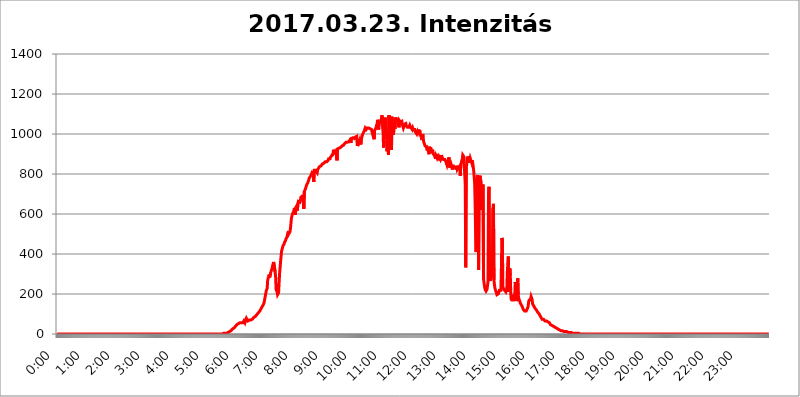
| Category | 2017.03.23. Intenzitás [W/m^2] |
|---|---|
| 0.0 | 0 |
| 0.0006944444444444445 | 0 |
| 0.001388888888888889 | 0 |
| 0.0020833333333333333 | 0 |
| 0.002777777777777778 | 0 |
| 0.003472222222222222 | 0 |
| 0.004166666666666667 | 0 |
| 0.004861111111111111 | 0 |
| 0.005555555555555556 | 0 |
| 0.0062499999999999995 | 0 |
| 0.006944444444444444 | 0 |
| 0.007638888888888889 | 0 |
| 0.008333333333333333 | 0 |
| 0.009027777777777779 | 0 |
| 0.009722222222222222 | 0 |
| 0.010416666666666666 | 0 |
| 0.011111111111111112 | 0 |
| 0.011805555555555555 | 0 |
| 0.012499999999999999 | 0 |
| 0.013194444444444444 | 0 |
| 0.013888888888888888 | 0 |
| 0.014583333333333332 | 0 |
| 0.015277777777777777 | 0 |
| 0.015972222222222224 | 0 |
| 0.016666666666666666 | 0 |
| 0.017361111111111112 | 0 |
| 0.018055555555555557 | 0 |
| 0.01875 | 0 |
| 0.019444444444444445 | 0 |
| 0.02013888888888889 | 0 |
| 0.020833333333333332 | 0 |
| 0.02152777777777778 | 0 |
| 0.022222222222222223 | 0 |
| 0.02291666666666667 | 0 |
| 0.02361111111111111 | 0 |
| 0.024305555555555556 | 0 |
| 0.024999999999999998 | 0 |
| 0.025694444444444447 | 0 |
| 0.02638888888888889 | 0 |
| 0.027083333333333334 | 0 |
| 0.027777777777777776 | 0 |
| 0.02847222222222222 | 0 |
| 0.029166666666666664 | 0 |
| 0.029861111111111113 | 0 |
| 0.030555555555555555 | 0 |
| 0.03125 | 0 |
| 0.03194444444444445 | 0 |
| 0.03263888888888889 | 0 |
| 0.03333333333333333 | 0 |
| 0.034027777777777775 | 0 |
| 0.034722222222222224 | 0 |
| 0.035416666666666666 | 0 |
| 0.036111111111111115 | 0 |
| 0.03680555555555556 | 0 |
| 0.0375 | 0 |
| 0.03819444444444444 | 0 |
| 0.03888888888888889 | 0 |
| 0.03958333333333333 | 0 |
| 0.04027777777777778 | 0 |
| 0.04097222222222222 | 0 |
| 0.041666666666666664 | 0 |
| 0.042361111111111106 | 0 |
| 0.04305555555555556 | 0 |
| 0.043750000000000004 | 0 |
| 0.044444444444444446 | 0 |
| 0.04513888888888889 | 0 |
| 0.04583333333333334 | 0 |
| 0.04652777777777778 | 0 |
| 0.04722222222222222 | 0 |
| 0.04791666666666666 | 0 |
| 0.04861111111111111 | 0 |
| 0.049305555555555554 | 0 |
| 0.049999999999999996 | 0 |
| 0.05069444444444445 | 0 |
| 0.051388888888888894 | 0 |
| 0.052083333333333336 | 0 |
| 0.05277777777777778 | 0 |
| 0.05347222222222222 | 0 |
| 0.05416666666666667 | 0 |
| 0.05486111111111111 | 0 |
| 0.05555555555555555 | 0 |
| 0.05625 | 0 |
| 0.05694444444444444 | 0 |
| 0.057638888888888885 | 0 |
| 0.05833333333333333 | 0 |
| 0.05902777777777778 | 0 |
| 0.059722222222222225 | 0 |
| 0.06041666666666667 | 0 |
| 0.061111111111111116 | 0 |
| 0.06180555555555556 | 0 |
| 0.0625 | 0 |
| 0.06319444444444444 | 0 |
| 0.06388888888888888 | 0 |
| 0.06458333333333334 | 0 |
| 0.06527777777777778 | 0 |
| 0.06597222222222222 | 0 |
| 0.06666666666666667 | 0 |
| 0.06736111111111111 | 0 |
| 0.06805555555555555 | 0 |
| 0.06874999999999999 | 0 |
| 0.06944444444444443 | 0 |
| 0.07013888888888889 | 0 |
| 0.07083333333333333 | 0 |
| 0.07152777777777779 | 0 |
| 0.07222222222222223 | 0 |
| 0.07291666666666667 | 0 |
| 0.07361111111111111 | 0 |
| 0.07430555555555556 | 0 |
| 0.075 | 0 |
| 0.07569444444444444 | 0 |
| 0.0763888888888889 | 0 |
| 0.07708333333333334 | 0 |
| 0.07777777777777778 | 0 |
| 0.07847222222222222 | 0 |
| 0.07916666666666666 | 0 |
| 0.0798611111111111 | 0 |
| 0.08055555555555556 | 0 |
| 0.08125 | 0 |
| 0.08194444444444444 | 0 |
| 0.08263888888888889 | 0 |
| 0.08333333333333333 | 0 |
| 0.08402777777777777 | 0 |
| 0.08472222222222221 | 0 |
| 0.08541666666666665 | 0 |
| 0.08611111111111112 | 0 |
| 0.08680555555555557 | 0 |
| 0.08750000000000001 | 0 |
| 0.08819444444444445 | 0 |
| 0.08888888888888889 | 0 |
| 0.08958333333333333 | 0 |
| 0.09027777777777778 | 0 |
| 0.09097222222222222 | 0 |
| 0.09166666666666667 | 0 |
| 0.09236111111111112 | 0 |
| 0.09305555555555556 | 0 |
| 0.09375 | 0 |
| 0.09444444444444444 | 0 |
| 0.09513888888888888 | 0 |
| 0.09583333333333333 | 0 |
| 0.09652777777777777 | 0 |
| 0.09722222222222222 | 0 |
| 0.09791666666666667 | 0 |
| 0.09861111111111111 | 0 |
| 0.09930555555555555 | 0 |
| 0.09999999999999999 | 0 |
| 0.10069444444444443 | 0 |
| 0.1013888888888889 | 0 |
| 0.10208333333333335 | 0 |
| 0.10277777777777779 | 0 |
| 0.10347222222222223 | 0 |
| 0.10416666666666667 | 0 |
| 0.10486111111111111 | 0 |
| 0.10555555555555556 | 0 |
| 0.10625 | 0 |
| 0.10694444444444444 | 0 |
| 0.1076388888888889 | 0 |
| 0.10833333333333334 | 0 |
| 0.10902777777777778 | 0 |
| 0.10972222222222222 | 0 |
| 0.1111111111111111 | 0 |
| 0.11180555555555556 | 0 |
| 0.11180555555555556 | 0 |
| 0.1125 | 0 |
| 0.11319444444444444 | 0 |
| 0.11388888888888889 | 0 |
| 0.11458333333333333 | 0 |
| 0.11527777777777777 | 0 |
| 0.11597222222222221 | 0 |
| 0.11666666666666665 | 0 |
| 0.1173611111111111 | 0 |
| 0.11805555555555557 | 0 |
| 0.11944444444444445 | 0 |
| 0.12013888888888889 | 0 |
| 0.12083333333333333 | 0 |
| 0.12152777777777778 | 0 |
| 0.12222222222222223 | 0 |
| 0.12291666666666667 | 0 |
| 0.12291666666666667 | 0 |
| 0.12361111111111112 | 0 |
| 0.12430555555555556 | 0 |
| 0.125 | 0 |
| 0.12569444444444444 | 0 |
| 0.12638888888888888 | 0 |
| 0.12708333333333333 | 0 |
| 0.16875 | 0 |
| 0.12847222222222224 | 0 |
| 0.12916666666666668 | 0 |
| 0.12986111111111112 | 0 |
| 0.13055555555555556 | 0 |
| 0.13125 | 0 |
| 0.13194444444444445 | 0 |
| 0.1326388888888889 | 0 |
| 0.13333333333333333 | 0 |
| 0.13402777777777777 | 0 |
| 0.13402777777777777 | 0 |
| 0.13472222222222222 | 0 |
| 0.13541666666666666 | 0 |
| 0.1361111111111111 | 0 |
| 0.13749999999999998 | 0 |
| 0.13819444444444443 | 0 |
| 0.1388888888888889 | 0 |
| 0.13958333333333334 | 0 |
| 0.14027777777777778 | 0 |
| 0.14097222222222222 | 0 |
| 0.14166666666666666 | 0 |
| 0.1423611111111111 | 0 |
| 0.14305555555555557 | 0 |
| 0.14375000000000002 | 0 |
| 0.14444444444444446 | 0 |
| 0.1451388888888889 | 0 |
| 0.1451388888888889 | 0 |
| 0.14652777777777778 | 0 |
| 0.14722222222222223 | 0 |
| 0.14791666666666667 | 0 |
| 0.1486111111111111 | 0 |
| 0.14930555555555555 | 0 |
| 0.15 | 0 |
| 0.15069444444444444 | 0 |
| 0.15138888888888888 | 0 |
| 0.15208333333333332 | 0 |
| 0.15277777777777776 | 0 |
| 0.15347222222222223 | 0 |
| 0.15416666666666667 | 0 |
| 0.15486111111111112 | 0 |
| 0.15555555555555556 | 0 |
| 0.15625 | 0 |
| 0.15694444444444444 | 0 |
| 0.15763888888888888 | 0 |
| 0.15833333333333333 | 0 |
| 0.15902777777777777 | 0 |
| 0.15972222222222224 | 0 |
| 0.16041666666666668 | 0 |
| 0.16111111111111112 | 0 |
| 0.16180555555555556 | 0 |
| 0.1625 | 0 |
| 0.16319444444444445 | 0 |
| 0.1638888888888889 | 0 |
| 0.16458333333333333 | 0 |
| 0.16527777777777777 | 0 |
| 0.16597222222222222 | 0 |
| 0.16666666666666666 | 0 |
| 0.1673611111111111 | 0 |
| 0.16805555555555554 | 0 |
| 0.16874999999999998 | 0 |
| 0.16944444444444443 | 0 |
| 0.17013888888888887 | 0 |
| 0.1708333333333333 | 0 |
| 0.17152777777777775 | 0 |
| 0.17222222222222225 | 0 |
| 0.1729166666666667 | 0 |
| 0.17361111111111113 | 0 |
| 0.17430555555555557 | 0 |
| 0.17500000000000002 | 0 |
| 0.17569444444444446 | 0 |
| 0.1763888888888889 | 0 |
| 0.17708333333333334 | 0 |
| 0.17777777777777778 | 0 |
| 0.17847222222222223 | 0 |
| 0.17916666666666667 | 0 |
| 0.1798611111111111 | 0 |
| 0.18055555555555555 | 0 |
| 0.18125 | 0 |
| 0.18194444444444444 | 0 |
| 0.1826388888888889 | 0 |
| 0.18333333333333335 | 0 |
| 0.1840277777777778 | 0 |
| 0.18472222222222223 | 0 |
| 0.18541666666666667 | 0 |
| 0.18611111111111112 | 0 |
| 0.18680555555555556 | 0 |
| 0.1875 | 0 |
| 0.18819444444444444 | 0 |
| 0.18888888888888888 | 0 |
| 0.18958333333333333 | 0 |
| 0.19027777777777777 | 0 |
| 0.1909722222222222 | 0 |
| 0.19166666666666665 | 0 |
| 0.19236111111111112 | 0 |
| 0.19305555555555554 | 0 |
| 0.19375 | 0 |
| 0.19444444444444445 | 0 |
| 0.1951388888888889 | 0 |
| 0.19583333333333333 | 0 |
| 0.19652777777777777 | 0 |
| 0.19722222222222222 | 0 |
| 0.19791666666666666 | 0 |
| 0.1986111111111111 | 0 |
| 0.19930555555555554 | 0 |
| 0.19999999999999998 | 0 |
| 0.20069444444444443 | 0 |
| 0.20138888888888887 | 0 |
| 0.2020833333333333 | 0 |
| 0.2027777777777778 | 0 |
| 0.2034722222222222 | 0 |
| 0.2041666666666667 | 0 |
| 0.20486111111111113 | 0 |
| 0.20555555555555557 | 0 |
| 0.20625000000000002 | 0 |
| 0.20694444444444446 | 0 |
| 0.2076388888888889 | 0 |
| 0.20833333333333334 | 0 |
| 0.20902777777777778 | 0 |
| 0.20972222222222223 | 0 |
| 0.21041666666666667 | 0 |
| 0.2111111111111111 | 0 |
| 0.21180555555555555 | 0 |
| 0.2125 | 0 |
| 0.21319444444444444 | 0 |
| 0.2138888888888889 | 0 |
| 0.21458333333333335 | 0 |
| 0.2152777777777778 | 0 |
| 0.21597222222222223 | 0 |
| 0.21666666666666667 | 0 |
| 0.21736111111111112 | 0 |
| 0.21805555555555556 | 0 |
| 0.21875 | 0 |
| 0.21944444444444444 | 0 |
| 0.22013888888888888 | 0 |
| 0.22083333333333333 | 0 |
| 0.22152777777777777 | 0 |
| 0.2222222222222222 | 0 |
| 0.22291666666666665 | 0 |
| 0.2236111111111111 | 0 |
| 0.22430555555555556 | 0 |
| 0.225 | 0 |
| 0.22569444444444445 | 0 |
| 0.2263888888888889 | 0 |
| 0.22708333333333333 | 0 |
| 0.22777777777777777 | 0 |
| 0.22847222222222222 | 0 |
| 0.22916666666666666 | 0 |
| 0.2298611111111111 | 0 |
| 0.23055555555555554 | 0 |
| 0.23124999999999998 | 0 |
| 0.23194444444444443 | 0 |
| 0.23263888888888887 | 0 |
| 0.2333333333333333 | 3.525 |
| 0.2340277777777778 | 0 |
| 0.2347222222222222 | 3.525 |
| 0.2354166666666667 | 3.525 |
| 0.23611111111111113 | 3.525 |
| 0.23680555555555557 | 3.525 |
| 0.23750000000000002 | 3.525 |
| 0.23819444444444446 | 3.525 |
| 0.2388888888888889 | 7.887 |
| 0.23958333333333334 | 7.887 |
| 0.24027777777777778 | 7.887 |
| 0.24097222222222223 | 12.257 |
| 0.24166666666666667 | 12.257 |
| 0.2423611111111111 | 12.257 |
| 0.24305555555555555 | 16.636 |
| 0.24375 | 16.636 |
| 0.24444444444444446 | 21.024 |
| 0.24513888888888888 | 21.024 |
| 0.24583333333333335 | 25.419 |
| 0.2465277777777778 | 25.419 |
| 0.24722222222222223 | 29.823 |
| 0.24791666666666667 | 29.823 |
| 0.24861111111111112 | 34.234 |
| 0.24930555555555556 | 34.234 |
| 0.25 | 38.653 |
| 0.25069444444444444 | 38.653 |
| 0.2513888888888889 | 43.079 |
| 0.2520833333333333 | 47.511 |
| 0.25277777777777777 | 47.511 |
| 0.2534722222222222 | 47.511 |
| 0.25416666666666665 | 51.951 |
| 0.2548611111111111 | 51.951 |
| 0.2555555555555556 | 56.398 |
| 0.25625000000000003 | 56.398 |
| 0.2569444444444445 | 56.398 |
| 0.2576388888888889 | 51.951 |
| 0.25833333333333336 | 56.398 |
| 0.2590277777777778 | 56.398 |
| 0.25972222222222224 | 51.951 |
| 0.2604166666666667 | 56.398 |
| 0.2611111111111111 | 60.85 |
| 0.26180555555555557 | 65.31 |
| 0.2625 | 65.31 |
| 0.26319444444444445 | 56.398 |
| 0.2638888888888889 | 65.31 |
| 0.26458333333333334 | 69.775 |
| 0.2652777777777778 | 78.722 |
| 0.2659722222222222 | 78.722 |
| 0.26666666666666666 | 74.246 |
| 0.2673611111111111 | 65.31 |
| 0.26805555555555555 | 65.31 |
| 0.26875 | 65.31 |
| 0.26944444444444443 | 69.775 |
| 0.2701388888888889 | 69.775 |
| 0.2708333333333333 | 69.775 |
| 0.27152777777777776 | 69.775 |
| 0.2722222222222222 | 74.246 |
| 0.27291666666666664 | 74.246 |
| 0.2736111111111111 | 74.246 |
| 0.2743055555555555 | 78.722 |
| 0.27499999999999997 | 78.722 |
| 0.27569444444444446 | 83.205 |
| 0.27638888888888885 | 83.205 |
| 0.27708333333333335 | 87.692 |
| 0.2777777777777778 | 87.692 |
| 0.27847222222222223 | 92.184 |
| 0.2791666666666667 | 92.184 |
| 0.2798611111111111 | 96.682 |
| 0.28055555555555556 | 96.682 |
| 0.28125 | 101.184 |
| 0.28194444444444444 | 105.69 |
| 0.2826388888888889 | 110.201 |
| 0.2833333333333333 | 110.201 |
| 0.28402777777777777 | 114.716 |
| 0.2847222222222222 | 119.235 |
| 0.28541666666666665 | 123.758 |
| 0.28611111111111115 | 128.284 |
| 0.28680555555555554 | 132.814 |
| 0.28750000000000003 | 137.347 |
| 0.2881944444444445 | 141.884 |
| 0.2888888888888889 | 146.423 |
| 0.28958333333333336 | 150.964 |
| 0.2902777777777778 | 160.056 |
| 0.29097222222222224 | 164.605 |
| 0.2916666666666667 | 187.378 |
| 0.2923611111111111 | 191.937 |
| 0.29305555555555557 | 214.746 |
| 0.29375 | 210.182 |
| 0.29444444444444445 | 228.436 |
| 0.2951388888888889 | 269.49 |
| 0.29583333333333334 | 278.603 |
| 0.2965277777777778 | 287.709 |
| 0.2972222222222222 | 296.808 |
| 0.29791666666666666 | 283.156 |
| 0.2986111111111111 | 287.709 |
| 0.29930555555555555 | 305.898 |
| 0.3 | 310.44 |
| 0.30069444444444443 | 310.44 |
| 0.3013888888888889 | 328.584 |
| 0.3020833333333333 | 342.162 |
| 0.30277777777777776 | 346.682 |
| 0.3034722222222222 | 360.221 |
| 0.30416666666666664 | 355.712 |
| 0.3048611111111111 | 355.712 |
| 0.3055555555555555 | 310.44 |
| 0.30624999999999997 | 287.709 |
| 0.3069444444444444 | 223.873 |
| 0.3076388888888889 | 223.873 |
| 0.30833333333333335 | 210.182 |
| 0.3090277777777778 | 196.497 |
| 0.30972222222222223 | 201.058 |
| 0.3104166666666667 | 205.62 |
| 0.3111111111111111 | 210.182 |
| 0.31180555555555556 | 301.354 |
| 0.3125 | 328.584 |
| 0.31319444444444444 | 360.221 |
| 0.3138888888888889 | 387.202 |
| 0.3145833333333333 | 414.035 |
| 0.31527777777777777 | 418.492 |
| 0.3159722222222222 | 431.833 |
| 0.31666666666666665 | 440.702 |
| 0.31736111111111115 | 440.702 |
| 0.31805555555555554 | 449.551 |
| 0.31875000000000003 | 458.38 |
| 0.3194444444444445 | 462.786 |
| 0.3201388888888889 | 467.187 |
| 0.32083333333333336 | 475.972 |
| 0.3215277777777778 | 480.356 |
| 0.32222222222222224 | 484.735 |
| 0.3229166666666667 | 497.836 |
| 0.3236111111111111 | 497.836 |
| 0.32430555555555557 | 515.223 |
| 0.325 | 502.192 |
| 0.32569444444444445 | 506.542 |
| 0.3263888888888889 | 510.885 |
| 0.32708333333333334 | 528.2 |
| 0.3277777777777778 | 553.986 |
| 0.3284722222222222 | 579.542 |
| 0.32916666666666666 | 583.779 |
| 0.3298611111111111 | 600.661 |
| 0.33055555555555555 | 604.864 |
| 0.33125 | 609.062 |
| 0.33194444444444443 | 617.436 |
| 0.3326388888888889 | 629.948 |
| 0.3333333333333333 | 621.613 |
| 0.3340277777777778 | 596.45 |
| 0.3347222222222222 | 634.105 |
| 0.3354166666666667 | 638.256 |
| 0.3361111111111111 | 642.4 |
| 0.3368055555555556 | 617.436 |
| 0.33749999999999997 | 650.667 |
| 0.33819444444444446 | 663.019 |
| 0.33888888888888885 | 658.909 |
| 0.33958333333333335 | 663.019 |
| 0.34027777777777773 | 658.909 |
| 0.34097222222222223 | 667.123 |
| 0.3416666666666666 | 683.473 |
| 0.3423611111111111 | 683.473 |
| 0.3430555555555555 | 683.473 |
| 0.34375 | 687.544 |
| 0.3444444444444445 | 695.666 |
| 0.3451388888888889 | 699.717 |
| 0.3458333333333334 | 625.784 |
| 0.34652777777777777 | 711.832 |
| 0.34722222222222227 | 715.858 |
| 0.34791666666666665 | 723.889 |
| 0.34861111111111115 | 731.896 |
| 0.34930555555555554 | 735.89 |
| 0.35000000000000003 | 747.834 |
| 0.3506944444444444 | 751.803 |
| 0.3513888888888889 | 755.766 |
| 0.3520833333333333 | 763.674 |
| 0.3527777777777778 | 771.559 |
| 0.3534722222222222 | 779.42 |
| 0.3541666666666667 | 779.42 |
| 0.3548611111111111 | 783.342 |
| 0.35555555555555557 | 791.169 |
| 0.35625 | 795.074 |
| 0.35694444444444445 | 802.868 |
| 0.3576388888888889 | 806.757 |
| 0.35833333333333334 | 791.169 |
| 0.3590277777777778 | 814.519 |
| 0.3597222222222222 | 759.723 |
| 0.36041666666666666 | 818.392 |
| 0.3611111111111111 | 814.519 |
| 0.36180555555555555 | 818.392 |
| 0.3625 | 818.392 |
| 0.36319444444444443 | 818.392 |
| 0.3638888888888889 | 818.392 |
| 0.3645833333333333 | 806.757 |
| 0.3652777777777778 | 822.26 |
| 0.3659722222222222 | 826.123 |
| 0.3666666666666667 | 829.981 |
| 0.3673611111111111 | 829.981 |
| 0.3680555555555556 | 837.682 |
| 0.36874999999999997 | 837.682 |
| 0.36944444444444446 | 837.682 |
| 0.37013888888888885 | 841.526 |
| 0.37083333333333335 | 845.365 |
| 0.37152777777777773 | 849.199 |
| 0.37222222222222223 | 849.199 |
| 0.3729166666666666 | 853.029 |
| 0.3736111111111111 | 853.029 |
| 0.3743055555555555 | 856.855 |
| 0.375 | 856.855 |
| 0.3756944444444445 | 860.676 |
| 0.3763888888888889 | 860.676 |
| 0.3770833333333334 | 860.676 |
| 0.37777777777777777 | 860.676 |
| 0.37847222222222227 | 864.493 |
| 0.37916666666666665 | 864.493 |
| 0.37986111111111115 | 868.305 |
| 0.38055555555555554 | 875.918 |
| 0.38125000000000003 | 879.719 |
| 0.3819444444444444 | 875.918 |
| 0.3826388888888889 | 875.918 |
| 0.3833333333333333 | 883.516 |
| 0.3840277777777778 | 887.309 |
| 0.3847222222222222 | 891.099 |
| 0.3854166666666667 | 894.885 |
| 0.3861111111111111 | 894.885 |
| 0.38680555555555557 | 902.447 |
| 0.3875 | 921.298 |
| 0.38819444444444445 | 906.223 |
| 0.3888888888888889 | 906.223 |
| 0.38958333333333334 | 913.766 |
| 0.3902777777777778 | 917.534 |
| 0.3909722222222222 | 902.447 |
| 0.39166666666666666 | 917.534 |
| 0.3923611111111111 | 868.305 |
| 0.39305555555555555 | 925.06 |
| 0.39375 | 925.06 |
| 0.39444444444444443 | 925.06 |
| 0.3951388888888889 | 928.819 |
| 0.3958333333333333 | 928.819 |
| 0.3965277777777778 | 932.576 |
| 0.3972222222222222 | 932.576 |
| 0.3979166666666667 | 932.576 |
| 0.3986111111111111 | 936.33 |
| 0.3993055555555556 | 940.082 |
| 0.39999999999999997 | 940.082 |
| 0.40069444444444446 | 943.832 |
| 0.40138888888888885 | 943.832 |
| 0.40208333333333335 | 947.58 |
| 0.40277777777777773 | 951.327 |
| 0.40347222222222223 | 951.327 |
| 0.4041666666666666 | 955.071 |
| 0.4048611111111111 | 958.814 |
| 0.4055555555555555 | 958.814 |
| 0.40625 | 955.071 |
| 0.4069444444444445 | 958.814 |
| 0.4076388888888889 | 958.814 |
| 0.4083333333333334 | 962.555 |
| 0.40902777777777777 | 962.555 |
| 0.40972222222222227 | 966.295 |
| 0.41041666666666665 | 970.034 |
| 0.41111111111111115 | 970.034 |
| 0.41180555555555554 | 955.071 |
| 0.41250000000000003 | 977.508 |
| 0.4131944444444444 | 977.508 |
| 0.4138888888888889 | 977.508 |
| 0.4145833333333333 | 981.244 |
| 0.4152777777777778 | 977.508 |
| 0.4159722222222222 | 977.508 |
| 0.4166666666666667 | 977.508 |
| 0.4173611111111111 | 981.244 |
| 0.41805555555555557 | 984.98 |
| 0.41875 | 984.98 |
| 0.41944444444444445 | 984.98 |
| 0.4201388888888889 | 988.714 |
| 0.42083333333333334 | 940.082 |
| 0.4215277777777778 | 947.58 |
| 0.4222222222222222 | 958.814 |
| 0.42291666666666666 | 973.772 |
| 0.4236111111111111 | 962.555 |
| 0.42430555555555555 | 970.034 |
| 0.425 | 970.034 |
| 0.42569444444444443 | 947.58 |
| 0.4263888888888889 | 966.295 |
| 0.4270833333333333 | 984.98 |
| 0.4277777777777778 | 984.98 |
| 0.4284722222222222 | 999.916 |
| 0.4291666666666667 | 999.916 |
| 0.4298611111111111 | 999.916 |
| 0.4305555555555556 | 1014.852 |
| 0.43124999999999997 | 1018.587 |
| 0.43194444444444446 | 1029.798 |
| 0.43263888888888885 | 1029.798 |
| 0.43333333333333335 | 1022.323 |
| 0.43402777777777773 | 1026.06 |
| 0.43472222222222223 | 1029.798 |
| 0.4354166666666666 | 1029.798 |
| 0.4361111111111111 | 1033.537 |
| 0.4368055555555555 | 1029.798 |
| 0.4375 | 1029.798 |
| 0.4381944444444445 | 1029.798 |
| 0.4388888888888889 | 1026.06 |
| 0.4395833333333334 | 1029.798 |
| 0.44027777777777777 | 1022.323 |
| 0.44097222222222227 | 1022.323 |
| 0.44166666666666665 | 1007.383 |
| 0.44236111111111115 | 1011.118 |
| 0.44305555555555554 | 1007.383 |
| 0.44375000000000003 | 981.244 |
| 0.4444444444444444 | 973.772 |
| 0.4451388888888889 | 1018.587 |
| 0.4458333333333333 | 1014.852 |
| 0.4465277777777778 | 1026.06 |
| 0.4472222222222222 | 1033.537 |
| 0.4479166666666667 | 1044.762 |
| 0.4486111111111111 | 1052.255 |
| 0.44930555555555557 | 1071.027 |
| 0.45 | 1059.756 |
| 0.45069444444444445 | 1022.323 |
| 0.4513888888888889 | 1052.255 |
| 0.45208333333333334 | 1063.51 |
| 0.4527777777777778 | 1052.255 |
| 0.4534722222222222 | 1052.255 |
| 0.45416666666666666 | 1071.027 |
| 0.4548611111111111 | 1078.555 |
| 0.45555555555555555 | 1093.653 |
| 0.45625 | 1089.873 |
| 0.45694444444444443 | 1018.587 |
| 0.4576388888888889 | 932.576 |
| 0.4583333333333333 | 966.295 |
| 0.4590277777777778 | 1052.255 |
| 0.4597222222222222 | 1082.324 |
| 0.4604166666666667 | 1067.267 |
| 0.4611111111111111 | 1071.027 |
| 0.4618055555555556 | 992.448 |
| 0.46249999999999997 | 913.766 |
| 0.46319444444444446 | 970.034 |
| 0.46388888888888885 | 921.298 |
| 0.46458333333333335 | 894.885 |
| 0.46527777777777773 | 1093.653 |
| 0.46597222222222223 | 1037.277 |
| 0.4666666666666666 | 943.832 |
| 0.4673611111111111 | 943.832 |
| 0.4680555555555555 | 992.448 |
| 0.46875 | 921.298 |
| 0.4694444444444445 | 1086.097 |
| 0.4701388888888889 | 1037.277 |
| 0.4708333333333334 | 1029.798 |
| 0.47152777777777777 | 996.182 |
| 0.47222222222222227 | 999.916 |
| 0.47291666666666665 | 1063.51 |
| 0.47361111111111115 | 1026.06 |
| 0.47430555555555554 | 1082.324 |
| 0.47500000000000003 | 1074.789 |
| 0.4756944444444444 | 1071.027 |
| 0.4763888888888889 | 1078.555 |
| 0.4770833333333333 | 1074.789 |
| 0.4777777777777778 | 1067.267 |
| 0.4784722222222222 | 1074.789 |
| 0.4791666666666667 | 1033.537 |
| 0.4798611111111111 | 1067.267 |
| 0.48055555555555557 | 1067.267 |
| 0.48125 | 1059.756 |
| 0.48194444444444445 | 1059.756 |
| 0.4826388888888889 | 1063.51 |
| 0.48333333333333334 | 1063.51 |
| 0.4840277777777778 | 1044.762 |
| 0.4847222222222222 | 1044.762 |
| 0.48541666666666666 | 1029.798 |
| 0.4861111111111111 | 1037.277 |
| 0.48680555555555555 | 1048.508 |
| 0.4875 | 1044.762 |
| 0.48819444444444443 | 1044.762 |
| 0.4888888888888889 | 1052.255 |
| 0.4895833333333333 | 1041.019 |
| 0.4902777777777778 | 1037.277 |
| 0.4909722222222222 | 1033.537 |
| 0.4916666666666667 | 1033.537 |
| 0.4923611111111111 | 1033.537 |
| 0.4930555555555556 | 1033.537 |
| 0.49374999999999997 | 1037.277 |
| 0.49444444444444446 | 1044.762 |
| 0.49513888888888885 | 1041.019 |
| 0.49583333333333335 | 1033.537 |
| 0.49652777777777773 | 1029.798 |
| 0.49722222222222223 | 1033.537 |
| 0.4979166666666666 | 1022.323 |
| 0.4986111111111111 | 1029.798 |
| 0.4993055555555555 | 1022.323 |
| 0.5 | 1018.587 |
| 0.5006944444444444 | 1026.06 |
| 0.5013888888888889 | 1022.323 |
| 0.5020833333333333 | 1011.118 |
| 0.5027777777777778 | 1007.383 |
| 0.5034722222222222 | 1007.383 |
| 0.5041666666666667 | 999.916 |
| 0.5048611111111111 | 1007.383 |
| 0.5055555555555555 | 996.182 |
| 0.50625 | 1007.383 |
| 0.5069444444444444 | 1022.323 |
| 0.5076388888888889 | 1011.118 |
| 0.5083333333333333 | 1018.587 |
| 0.5090277777777777 | 999.916 |
| 0.5097222222222222 | 992.448 |
| 0.5104166666666666 | 999.916 |
| 0.5111111111111112 | 977.508 |
| 0.5118055555555555 | 970.034 |
| 0.5125000000000001 | 999.916 |
| 0.5131944444444444 | 984.98 |
| 0.513888888888889 | 962.555 |
| 0.5145833333333333 | 958.814 |
| 0.5152777777777778 | 947.58 |
| 0.5159722222222222 | 940.082 |
| 0.5166666666666667 | 936.33 |
| 0.517361111111111 | 943.832 |
| 0.5180555555555556 | 932.576 |
| 0.5187499999999999 | 917.534 |
| 0.5194444444444445 | 925.06 |
| 0.5201388888888888 | 925.06 |
| 0.5208333333333334 | 909.996 |
| 0.5215277777777778 | 898.668 |
| 0.5222222222222223 | 936.33 |
| 0.5229166666666667 | 917.534 |
| 0.5236111111111111 | 932.576 |
| 0.5243055555555556 | 925.06 |
| 0.525 | 913.766 |
| 0.5256944444444445 | 906.223 |
| 0.5263888888888889 | 921.298 |
| 0.5270833333333333 | 902.447 |
| 0.5277777777777778 | 902.447 |
| 0.5284722222222222 | 898.668 |
| 0.5291666666666667 | 891.099 |
| 0.5298611111111111 | 891.099 |
| 0.5305555555555556 | 875.918 |
| 0.53125 | 891.099 |
| 0.5319444444444444 | 894.885 |
| 0.5326388888888889 | 879.719 |
| 0.5333333333333333 | 887.309 |
| 0.5340277777777778 | 887.309 |
| 0.5347222222222222 | 879.719 |
| 0.5354166666666667 | 887.309 |
| 0.5361111111111111 | 887.309 |
| 0.5368055555555555 | 887.309 |
| 0.5375 | 872.114 |
| 0.5381944444444444 | 879.719 |
| 0.5388888888888889 | 894.885 |
| 0.5395833333333333 | 883.516 |
| 0.5402777777777777 | 887.309 |
| 0.5409722222222222 | 883.516 |
| 0.5416666666666666 | 872.114 |
| 0.5423611111111112 | 872.114 |
| 0.5430555555555555 | 872.114 |
| 0.5437500000000001 | 872.114 |
| 0.5444444444444444 | 868.305 |
| 0.545138888888889 | 860.676 |
| 0.5458333333333333 | 853.029 |
| 0.5465277777777778 | 845.365 |
| 0.5472222222222222 | 856.855 |
| 0.5479166666666667 | 860.676 |
| 0.548611111111111 | 868.305 |
| 0.5493055555555556 | 883.516 |
| 0.5499999999999999 | 845.365 |
| 0.5506944444444445 | 829.981 |
| 0.5513888888888888 | 845.365 |
| 0.5520833333333334 | 853.029 |
| 0.5527777777777778 | 845.365 |
| 0.5534722222222223 | 833.834 |
| 0.5541666666666667 | 822.26 |
| 0.5548611111111111 | 845.365 |
| 0.5555555555555556 | 837.682 |
| 0.55625 | 837.682 |
| 0.5569444444444445 | 837.682 |
| 0.5576388888888889 | 829.981 |
| 0.5583333333333333 | 826.123 |
| 0.5590277777777778 | 826.123 |
| 0.5597222222222222 | 826.123 |
| 0.5604166666666667 | 841.526 |
| 0.5611111111111111 | 822.26 |
| 0.5618055555555556 | 826.123 |
| 0.5625 | 829.981 |
| 0.5631944444444444 | 822.26 |
| 0.5638888888888889 | 833.834 |
| 0.5645833333333333 | 826.123 |
| 0.5652777777777778 | 791.169 |
| 0.5659722222222222 | 849.199 |
| 0.5666666666666667 | 856.855 |
| 0.5673611111111111 | 860.676 |
| 0.5680555555555555 | 875.918 |
| 0.56875 | 894.885 |
| 0.5694444444444444 | 898.668 |
| 0.5701388888888889 | 887.309 |
| 0.5708333333333333 | 887.309 |
| 0.5715277777777777 | 883.516 |
| 0.5722222222222222 | 751.803 |
| 0.5729166666666666 | 333.113 |
| 0.5736111111111112 | 833.834 |
| 0.5743055555555555 | 845.365 |
| 0.5750000000000001 | 887.309 |
| 0.5756944444444444 | 887.309 |
| 0.576388888888889 | 875.918 |
| 0.5770833333333333 | 868.305 |
| 0.5777777777777778 | 856.855 |
| 0.5784722222222222 | 868.305 |
| 0.5791666666666667 | 879.719 |
| 0.579861111111111 | 872.114 |
| 0.5805555555555556 | 864.493 |
| 0.5812499999999999 | 856.855 |
| 0.5819444444444445 | 868.305 |
| 0.5826388888888888 | 856.855 |
| 0.5833333333333334 | 837.682 |
| 0.5840277777777778 | 818.392 |
| 0.5847222222222223 | 787.258 |
| 0.5854166666666667 | 755.766 |
| 0.5861111111111111 | 650.667 |
| 0.5868055555555556 | 497.836 |
| 0.5875 | 409.574 |
| 0.5881944444444445 | 775.492 |
| 0.5888888888888889 | 783.342 |
| 0.5895833333333333 | 795.074 |
| 0.5902777777777778 | 751.803 |
| 0.5909722222222222 | 319.517 |
| 0.5916666666666667 | 723.889 |
| 0.5923611111111111 | 683.473 |
| 0.5930555555555556 | 791.169 |
| 0.59375 | 795.074 |
| 0.5944444444444444 | 751.803 |
| 0.5951388888888889 | 621.613 |
| 0.5958333333333333 | 707.8 |
| 0.5965277777777778 | 739.877 |
| 0.5972222222222222 | 747.834 |
| 0.5979166666666667 | 274.047 |
| 0.5986111111111111 | 278.603 |
| 0.5993055555555555 | 237.564 |
| 0.6 | 223.873 |
| 0.6006944444444444 | 219.309 |
| 0.6013888888888889 | 214.746 |
| 0.6020833333333333 | 214.746 |
| 0.6027777777777777 | 223.873 |
| 0.6034722222222222 | 228.436 |
| 0.6041666666666666 | 260.373 |
| 0.6048611111111112 | 699.717 |
| 0.6055555555555555 | 735.89 |
| 0.6062500000000001 | 314.98 |
| 0.6069444444444444 | 292.259 |
| 0.607638888888889 | 264.932 |
| 0.6083333333333333 | 269.49 |
| 0.6090277777777778 | 364.728 |
| 0.6097222222222222 | 319.517 |
| 0.6104166666666667 | 283.156 |
| 0.611111111111111 | 629.948 |
| 0.6118055555555556 | 650.667 |
| 0.6124999999999999 | 269.49 |
| 0.6131944444444445 | 246.689 |
| 0.6138888888888888 | 228.436 |
| 0.6145833333333334 | 223.873 |
| 0.6152777777777778 | 223.873 |
| 0.6159722222222223 | 205.62 |
| 0.6166666666666667 | 196.497 |
| 0.6173611111111111 | 201.058 |
| 0.6180555555555556 | 196.497 |
| 0.61875 | 201.058 |
| 0.6194444444444445 | 210.182 |
| 0.6201388888888889 | 219.309 |
| 0.6208333333333333 | 219.309 |
| 0.6215277777777778 | 219.309 |
| 0.6222222222222222 | 219.309 |
| 0.6229166666666667 | 328.584 |
| 0.6236111111111111 | 480.356 |
| 0.6243055555555556 | 471.582 |
| 0.625 | 237.564 |
| 0.6256944444444444 | 228.436 |
| 0.6263888888888889 | 223.873 |
| 0.6270833333333333 | 219.309 |
| 0.6277777777777778 | 219.309 |
| 0.6284722222222222 | 219.309 |
| 0.6291666666666667 | 210.182 |
| 0.6298611111111111 | 205.62 |
| 0.6305555555555555 | 228.436 |
| 0.63125 | 310.44 |
| 0.6319444444444444 | 351.198 |
| 0.6326388888888889 | 387.202 |
| 0.6333333333333333 | 210.182 |
| 0.6340277777777777 | 255.813 |
| 0.6347222222222222 | 328.584 |
| 0.6354166666666666 | 292.259 |
| 0.6361111111111112 | 201.058 |
| 0.6368055555555555 | 169.156 |
| 0.6375000000000001 | 178.264 |
| 0.6381944444444444 | 164.605 |
| 0.638888888888889 | 160.056 |
| 0.6395833333333333 | 196.497 |
| 0.6402777777777778 | 164.605 |
| 0.6409722222222222 | 160.056 |
| 0.6416666666666667 | 191.937 |
| 0.642361111111111 | 260.373 |
| 0.6430555555555556 | 237.564 |
| 0.6437499999999999 | 164.605 |
| 0.6444444444444445 | 169.156 |
| 0.6451388888888888 | 182.82 |
| 0.6458333333333334 | 278.603 |
| 0.6465277777777778 | 196.497 |
| 0.6472222222222223 | 178.264 |
| 0.6479166666666667 | 173.709 |
| 0.6486111111111111 | 164.605 |
| 0.6493055555555556 | 155.509 |
| 0.65 | 150.964 |
| 0.6506944444444445 | 146.423 |
| 0.6513888888888889 | 141.884 |
| 0.6520833333333333 | 137.347 |
| 0.6527777777777778 | 132.814 |
| 0.6534722222222222 | 123.758 |
| 0.6541666666666667 | 119.235 |
| 0.6548611111111111 | 119.235 |
| 0.6555555555555556 | 114.716 |
| 0.65625 | 114.716 |
| 0.6569444444444444 | 114.716 |
| 0.6576388888888889 | 114.716 |
| 0.6583333333333333 | 119.235 |
| 0.6590277777777778 | 123.758 |
| 0.6597222222222222 | 128.284 |
| 0.6604166666666667 | 137.347 |
| 0.6611111111111111 | 160.056 |
| 0.6618055555555555 | 169.156 |
| 0.6625 | 164.605 |
| 0.6631944444444444 | 169.156 |
| 0.6638888888888889 | 173.709 |
| 0.6645833333333333 | 187.378 |
| 0.6652777777777777 | 187.378 |
| 0.6659722222222222 | 173.709 |
| 0.6666666666666666 | 150.964 |
| 0.6673611111111111 | 146.423 |
| 0.6680555555555556 | 150.964 |
| 0.6687500000000001 | 137.347 |
| 0.6694444444444444 | 137.347 |
| 0.6701388888888888 | 128.284 |
| 0.6708333333333334 | 123.758 |
| 0.6715277777777778 | 123.758 |
| 0.6722222222222222 | 119.235 |
| 0.6729166666666666 | 114.716 |
| 0.6736111111111112 | 110.201 |
| 0.6743055555555556 | 110.201 |
| 0.6749999999999999 | 105.69 |
| 0.6756944444444444 | 101.184 |
| 0.6763888888888889 | 96.682 |
| 0.6770833333333334 | 92.184 |
| 0.6777777777777777 | 87.692 |
| 0.6784722222222223 | 83.205 |
| 0.6791666666666667 | 78.722 |
| 0.6798611111111111 | 74.246 |
| 0.6805555555555555 | 74.246 |
| 0.68125 | 74.246 |
| 0.6819444444444445 | 74.246 |
| 0.6826388888888889 | 69.775 |
| 0.6833333333333332 | 69.775 |
| 0.6840277777777778 | 65.31 |
| 0.6847222222222222 | 65.31 |
| 0.6854166666666667 | 65.31 |
| 0.686111111111111 | 65.31 |
| 0.6868055555555556 | 65.31 |
| 0.6875 | 60.85 |
| 0.6881944444444444 | 60.85 |
| 0.688888888888889 | 56.398 |
| 0.6895833333333333 | 56.398 |
| 0.6902777777777778 | 56.398 |
| 0.6909722222222222 | 51.951 |
| 0.6916666666666668 | 47.511 |
| 0.6923611111111111 | 47.511 |
| 0.6930555555555555 | 43.079 |
| 0.69375 | 43.079 |
| 0.6944444444444445 | 43.079 |
| 0.6951388888888889 | 38.653 |
| 0.6958333333333333 | 38.653 |
| 0.6965277777777777 | 34.234 |
| 0.6972222222222223 | 34.234 |
| 0.6979166666666666 | 34.234 |
| 0.6986111111111111 | 29.823 |
| 0.6993055555555556 | 29.823 |
| 0.7000000000000001 | 29.823 |
| 0.7006944444444444 | 25.419 |
| 0.7013888888888888 | 25.419 |
| 0.7020833333333334 | 25.419 |
| 0.7027777777777778 | 25.419 |
| 0.7034722222222222 | 21.024 |
| 0.7041666666666666 | 21.024 |
| 0.7048611111111112 | 21.024 |
| 0.7055555555555556 | 21.024 |
| 0.7062499999999999 | 16.636 |
| 0.7069444444444444 | 16.636 |
| 0.7076388888888889 | 16.636 |
| 0.7083333333333334 | 16.636 |
| 0.7090277777777777 | 16.636 |
| 0.7097222222222223 | 12.257 |
| 0.7104166666666667 | 12.257 |
| 0.7111111111111111 | 12.257 |
| 0.7118055555555555 | 12.257 |
| 0.7125 | 12.257 |
| 0.7131944444444445 | 12.257 |
| 0.7138888888888889 | 12.257 |
| 0.7145833333333332 | 12.257 |
| 0.7152777777777778 | 7.887 |
| 0.7159722222222222 | 7.887 |
| 0.7166666666666667 | 7.887 |
| 0.717361111111111 | 7.887 |
| 0.7180555555555556 | 7.887 |
| 0.71875 | 7.887 |
| 0.7194444444444444 | 7.887 |
| 0.720138888888889 | 7.887 |
| 0.7208333333333333 | 7.887 |
| 0.7215277777777778 | 3.525 |
| 0.7222222222222222 | 3.525 |
| 0.7229166666666668 | 3.525 |
| 0.7236111111111111 | 3.525 |
| 0.7243055555555555 | 3.525 |
| 0.725 | 3.525 |
| 0.7256944444444445 | 3.525 |
| 0.7263888888888889 | 3.525 |
| 0.7270833333333333 | 3.525 |
| 0.7277777777777777 | 3.525 |
| 0.7284722222222223 | 3.525 |
| 0.7291666666666666 | 3.525 |
| 0.7298611111111111 | 3.525 |
| 0.7305555555555556 | 3.525 |
| 0.7312500000000001 | 3.525 |
| 0.7319444444444444 | 3.525 |
| 0.7326388888888888 | 3.525 |
| 0.7333333333333334 | 0 |
| 0.7340277777777778 | 0 |
| 0.7347222222222222 | 0 |
| 0.7354166666666666 | 0 |
| 0.7361111111111112 | 0 |
| 0.7368055555555556 | 0 |
| 0.7374999999999999 | 0 |
| 0.7381944444444444 | 0 |
| 0.7388888888888889 | 0 |
| 0.7395833333333334 | 0 |
| 0.7402777777777777 | 0 |
| 0.7409722222222223 | 0 |
| 0.7416666666666667 | 0 |
| 0.7423611111111111 | 0 |
| 0.7430555555555555 | 0 |
| 0.74375 | 0 |
| 0.7444444444444445 | 0 |
| 0.7451388888888889 | 0 |
| 0.7458333333333332 | 0 |
| 0.7465277777777778 | 0 |
| 0.7472222222222222 | 0 |
| 0.7479166666666667 | 0 |
| 0.748611111111111 | 0 |
| 0.7493055555555556 | 0 |
| 0.75 | 0 |
| 0.7506944444444444 | 0 |
| 0.751388888888889 | 0 |
| 0.7520833333333333 | 0 |
| 0.7527777777777778 | 0 |
| 0.7534722222222222 | 0 |
| 0.7541666666666668 | 0 |
| 0.7548611111111111 | 0 |
| 0.7555555555555555 | 0 |
| 0.75625 | 0 |
| 0.7569444444444445 | 0 |
| 0.7576388888888889 | 0 |
| 0.7583333333333333 | 0 |
| 0.7590277777777777 | 0 |
| 0.7597222222222223 | 0 |
| 0.7604166666666666 | 0 |
| 0.7611111111111111 | 0 |
| 0.7618055555555556 | 0 |
| 0.7625000000000001 | 0 |
| 0.7631944444444444 | 0 |
| 0.7638888888888888 | 0 |
| 0.7645833333333334 | 0 |
| 0.7652777777777778 | 0 |
| 0.7659722222222222 | 0 |
| 0.7666666666666666 | 0 |
| 0.7673611111111112 | 0 |
| 0.7680555555555556 | 0 |
| 0.7687499999999999 | 0 |
| 0.7694444444444444 | 0 |
| 0.7701388888888889 | 0 |
| 0.7708333333333334 | 0 |
| 0.7715277777777777 | 0 |
| 0.7722222222222223 | 0 |
| 0.7729166666666667 | 0 |
| 0.7736111111111111 | 0 |
| 0.7743055555555555 | 0 |
| 0.775 | 0 |
| 0.7756944444444445 | 0 |
| 0.7763888888888889 | 0 |
| 0.7770833333333332 | 0 |
| 0.7777777777777778 | 0 |
| 0.7784722222222222 | 0 |
| 0.7791666666666667 | 0 |
| 0.779861111111111 | 0 |
| 0.7805555555555556 | 0 |
| 0.78125 | 0 |
| 0.7819444444444444 | 0 |
| 0.782638888888889 | 0 |
| 0.7833333333333333 | 0 |
| 0.7840277777777778 | 0 |
| 0.7847222222222222 | 0 |
| 0.7854166666666668 | 0 |
| 0.7861111111111111 | 0 |
| 0.7868055555555555 | 0 |
| 0.7875 | 0 |
| 0.7881944444444445 | 0 |
| 0.7888888888888889 | 0 |
| 0.7895833333333333 | 0 |
| 0.7902777777777777 | 0 |
| 0.7909722222222223 | 0 |
| 0.7916666666666666 | 0 |
| 0.7923611111111111 | 0 |
| 0.7930555555555556 | 0 |
| 0.7937500000000001 | 0 |
| 0.7944444444444444 | 0 |
| 0.7951388888888888 | 0 |
| 0.7958333333333334 | 0 |
| 0.7965277777777778 | 0 |
| 0.7972222222222222 | 0 |
| 0.7979166666666666 | 0 |
| 0.7986111111111112 | 0 |
| 0.7993055555555556 | 0 |
| 0.7999999999999999 | 0 |
| 0.8006944444444444 | 0 |
| 0.8013888888888889 | 0 |
| 0.8020833333333334 | 0 |
| 0.8027777777777777 | 0 |
| 0.8034722222222223 | 0 |
| 0.8041666666666667 | 0 |
| 0.8048611111111111 | 0 |
| 0.8055555555555555 | 0 |
| 0.80625 | 0 |
| 0.8069444444444445 | 0 |
| 0.8076388888888889 | 0 |
| 0.8083333333333332 | 0 |
| 0.8090277777777778 | 0 |
| 0.8097222222222222 | 0 |
| 0.8104166666666667 | 0 |
| 0.811111111111111 | 0 |
| 0.8118055555555556 | 0 |
| 0.8125 | 0 |
| 0.8131944444444444 | 0 |
| 0.813888888888889 | 0 |
| 0.8145833333333333 | 0 |
| 0.8152777777777778 | 0 |
| 0.8159722222222222 | 0 |
| 0.8166666666666668 | 0 |
| 0.8173611111111111 | 0 |
| 0.8180555555555555 | 0 |
| 0.81875 | 0 |
| 0.8194444444444445 | 0 |
| 0.8201388888888889 | 0 |
| 0.8208333333333333 | 0 |
| 0.8215277777777777 | 0 |
| 0.8222222222222223 | 0 |
| 0.8229166666666666 | 0 |
| 0.8236111111111111 | 0 |
| 0.8243055555555556 | 0 |
| 0.8250000000000001 | 0 |
| 0.8256944444444444 | 0 |
| 0.8263888888888888 | 0 |
| 0.8270833333333334 | 0 |
| 0.8277777777777778 | 0 |
| 0.8284722222222222 | 0 |
| 0.8291666666666666 | 0 |
| 0.8298611111111112 | 0 |
| 0.8305555555555556 | 0 |
| 0.8312499999999999 | 0 |
| 0.8319444444444444 | 0 |
| 0.8326388888888889 | 0 |
| 0.8333333333333334 | 0 |
| 0.8340277777777777 | 0 |
| 0.8347222222222223 | 0 |
| 0.8354166666666667 | 0 |
| 0.8361111111111111 | 0 |
| 0.8368055555555555 | 0 |
| 0.8375 | 0 |
| 0.8381944444444445 | 0 |
| 0.8388888888888889 | 0 |
| 0.8395833333333332 | 0 |
| 0.8402777777777778 | 0 |
| 0.8409722222222222 | 0 |
| 0.8416666666666667 | 0 |
| 0.842361111111111 | 0 |
| 0.8430555555555556 | 0 |
| 0.84375 | 0 |
| 0.8444444444444444 | 0 |
| 0.845138888888889 | 0 |
| 0.8458333333333333 | 0 |
| 0.8465277777777778 | 0 |
| 0.8472222222222222 | 0 |
| 0.8479166666666668 | 0 |
| 0.8486111111111111 | 0 |
| 0.8493055555555555 | 0 |
| 0.85 | 0 |
| 0.8506944444444445 | 0 |
| 0.8513888888888889 | 0 |
| 0.8520833333333333 | 0 |
| 0.8527777777777777 | 0 |
| 0.8534722222222223 | 0 |
| 0.8541666666666666 | 0 |
| 0.8548611111111111 | 0 |
| 0.8555555555555556 | 0 |
| 0.8562500000000001 | 0 |
| 0.8569444444444444 | 0 |
| 0.8576388888888888 | 0 |
| 0.8583333333333334 | 0 |
| 0.8590277777777778 | 0 |
| 0.8597222222222222 | 0 |
| 0.8604166666666666 | 0 |
| 0.8611111111111112 | 0 |
| 0.8618055555555556 | 0 |
| 0.8624999999999999 | 0 |
| 0.8631944444444444 | 0 |
| 0.8638888888888889 | 0 |
| 0.8645833333333334 | 0 |
| 0.8652777777777777 | 0 |
| 0.8659722222222223 | 0 |
| 0.8666666666666667 | 0 |
| 0.8673611111111111 | 0 |
| 0.8680555555555555 | 0 |
| 0.86875 | 0 |
| 0.8694444444444445 | 0 |
| 0.8701388888888889 | 0 |
| 0.8708333333333332 | 0 |
| 0.8715277777777778 | 0 |
| 0.8722222222222222 | 0 |
| 0.8729166666666667 | 0 |
| 0.873611111111111 | 0 |
| 0.8743055555555556 | 0 |
| 0.875 | 0 |
| 0.8756944444444444 | 0 |
| 0.876388888888889 | 0 |
| 0.8770833333333333 | 0 |
| 0.8777777777777778 | 0 |
| 0.8784722222222222 | 0 |
| 0.8791666666666668 | 0 |
| 0.8798611111111111 | 0 |
| 0.8805555555555555 | 0 |
| 0.88125 | 0 |
| 0.8819444444444445 | 0 |
| 0.8826388888888889 | 0 |
| 0.8833333333333333 | 0 |
| 0.8840277777777777 | 0 |
| 0.8847222222222223 | 0 |
| 0.8854166666666666 | 0 |
| 0.8861111111111111 | 0 |
| 0.8868055555555556 | 0 |
| 0.8875000000000001 | 0 |
| 0.8881944444444444 | 0 |
| 0.8888888888888888 | 0 |
| 0.8895833333333334 | 0 |
| 0.8902777777777778 | 0 |
| 0.8909722222222222 | 0 |
| 0.8916666666666666 | 0 |
| 0.8923611111111112 | 0 |
| 0.8930555555555556 | 0 |
| 0.8937499999999999 | 0 |
| 0.8944444444444444 | 0 |
| 0.8951388888888889 | 0 |
| 0.8958333333333334 | 0 |
| 0.8965277777777777 | 0 |
| 0.8972222222222223 | 0 |
| 0.8979166666666667 | 0 |
| 0.8986111111111111 | 0 |
| 0.8993055555555555 | 0 |
| 0.9 | 0 |
| 0.9006944444444445 | 0 |
| 0.9013888888888889 | 0 |
| 0.9020833333333332 | 0 |
| 0.9027777777777778 | 0 |
| 0.9034722222222222 | 0 |
| 0.9041666666666667 | 0 |
| 0.904861111111111 | 0 |
| 0.9055555555555556 | 0 |
| 0.90625 | 0 |
| 0.9069444444444444 | 0 |
| 0.907638888888889 | 0 |
| 0.9083333333333333 | 0 |
| 0.9090277777777778 | 0 |
| 0.9097222222222222 | 0 |
| 0.9104166666666668 | 0 |
| 0.9111111111111111 | 0 |
| 0.9118055555555555 | 0 |
| 0.9125 | 0 |
| 0.9131944444444445 | 0 |
| 0.9138888888888889 | 0 |
| 0.9145833333333333 | 0 |
| 0.9152777777777777 | 0 |
| 0.9159722222222223 | 0 |
| 0.9166666666666666 | 0 |
| 0.9173611111111111 | 0 |
| 0.9180555555555556 | 0 |
| 0.9187500000000001 | 0 |
| 0.9194444444444444 | 0 |
| 0.9201388888888888 | 0 |
| 0.9208333333333334 | 0 |
| 0.9215277777777778 | 0 |
| 0.9222222222222222 | 0 |
| 0.9229166666666666 | 0 |
| 0.9236111111111112 | 0 |
| 0.9243055555555556 | 0 |
| 0.9249999999999999 | 0 |
| 0.9256944444444444 | 0 |
| 0.9263888888888889 | 0 |
| 0.9270833333333334 | 0 |
| 0.9277777777777777 | 0 |
| 0.9284722222222223 | 0 |
| 0.9291666666666667 | 0 |
| 0.9298611111111111 | 0 |
| 0.9305555555555555 | 0 |
| 0.93125 | 0 |
| 0.9319444444444445 | 0 |
| 0.9326388888888889 | 0 |
| 0.9333333333333332 | 0 |
| 0.9340277777777778 | 0 |
| 0.9347222222222222 | 0 |
| 0.9354166666666667 | 0 |
| 0.936111111111111 | 0 |
| 0.9368055555555556 | 0 |
| 0.9375 | 0 |
| 0.9381944444444444 | 0 |
| 0.938888888888889 | 0 |
| 0.9395833333333333 | 0 |
| 0.9402777777777778 | 0 |
| 0.9409722222222222 | 0 |
| 0.9416666666666668 | 0 |
| 0.9423611111111111 | 0 |
| 0.9430555555555555 | 0 |
| 0.94375 | 0 |
| 0.9444444444444445 | 0 |
| 0.9451388888888889 | 0 |
| 0.9458333333333333 | 0 |
| 0.9465277777777777 | 0 |
| 0.9472222222222223 | 0 |
| 0.9479166666666666 | 0 |
| 0.9486111111111111 | 0 |
| 0.9493055555555556 | 0 |
| 0.9500000000000001 | 0 |
| 0.9506944444444444 | 0 |
| 0.9513888888888888 | 0 |
| 0.9520833333333334 | 0 |
| 0.9527777777777778 | 0 |
| 0.9534722222222222 | 0 |
| 0.9541666666666666 | 0 |
| 0.9548611111111112 | 0 |
| 0.9555555555555556 | 0 |
| 0.9562499999999999 | 0 |
| 0.9569444444444444 | 0 |
| 0.9576388888888889 | 0 |
| 0.9583333333333334 | 0 |
| 0.9590277777777777 | 0 |
| 0.9597222222222223 | 0 |
| 0.9604166666666667 | 0 |
| 0.9611111111111111 | 0 |
| 0.9618055555555555 | 0 |
| 0.9625 | 0 |
| 0.9631944444444445 | 0 |
| 0.9638888888888889 | 0 |
| 0.9645833333333332 | 0 |
| 0.9652777777777778 | 0 |
| 0.9659722222222222 | 0 |
| 0.9666666666666667 | 0 |
| 0.967361111111111 | 0 |
| 0.9680555555555556 | 0 |
| 0.96875 | 0 |
| 0.9694444444444444 | 0 |
| 0.970138888888889 | 0 |
| 0.9708333333333333 | 0 |
| 0.9715277777777778 | 0 |
| 0.9722222222222222 | 0 |
| 0.9729166666666668 | 0 |
| 0.9736111111111111 | 0 |
| 0.9743055555555555 | 0 |
| 0.975 | 0 |
| 0.9756944444444445 | 0 |
| 0.9763888888888889 | 0 |
| 0.9770833333333333 | 0 |
| 0.9777777777777777 | 0 |
| 0.9784722222222223 | 0 |
| 0.9791666666666666 | 0 |
| 0.9798611111111111 | 0 |
| 0.9805555555555556 | 0 |
| 0.9812500000000001 | 0 |
| 0.9819444444444444 | 0 |
| 0.9826388888888888 | 0 |
| 0.9833333333333334 | 0 |
| 0.9840277777777778 | 0 |
| 0.9847222222222222 | 0 |
| 0.9854166666666666 | 0 |
| 0.9861111111111112 | 0 |
| 0.9868055555555556 | 0 |
| 0.9874999999999999 | 0 |
| 0.9881944444444444 | 0 |
| 0.9888888888888889 | 0 |
| 0.9895833333333334 | 0 |
| 0.9902777777777777 | 0 |
| 0.9909722222222223 | 0 |
| 0.9916666666666667 | 0 |
| 0.9923611111111111 | 0 |
| 0.9930555555555555 | 0 |
| 0.99375 | 0 |
| 0.9944444444444445 | 0 |
| 0.9951388888888889 | 0 |
| 0.9958333333333332 | 0 |
| 0.9965277777777778 | 0 |
| 0.9972222222222222 | 0 |
| 0.9979166666666667 | 0 |
| 0.998611111111111 | 0 |
| 0.9993055555555556 | 0 |